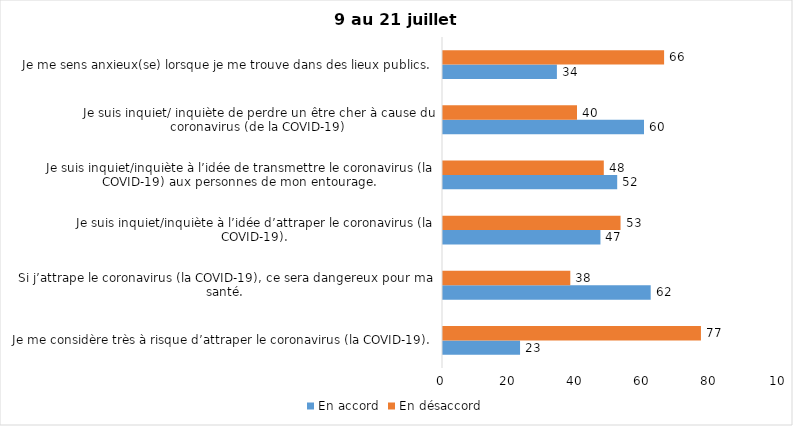
| Category | En accord | En désaccord |
|---|---|---|
| Je me considère très à risque d’attraper le coronavirus (la COVID-19). | 23 | 77 |
| Si j’attrape le coronavirus (la COVID-19), ce sera dangereux pour ma santé. | 62 | 38 |
| Je suis inquiet/inquiète à l’idée d’attraper le coronavirus (la COVID-19). | 47 | 53 |
| Je suis inquiet/inquiète à l’idée de transmettre le coronavirus (la COVID-19) aux personnes de mon entourage. | 52 | 48 |
| Je suis inquiet/ inquiète de perdre un être cher à cause du coronavirus (de la COVID-19) | 60 | 40 |
| Je me sens anxieux(se) lorsque je me trouve dans des lieux publics. | 34 | 66 |